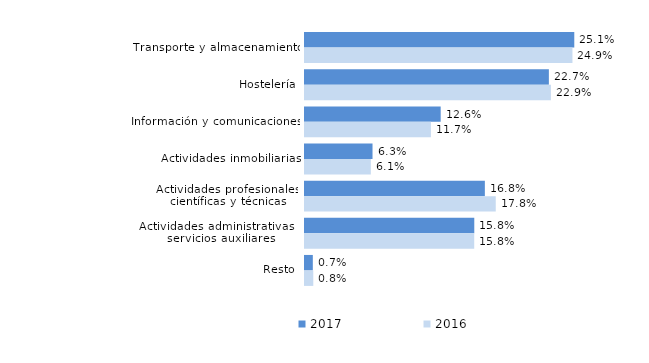
| Category | 2017 | 2016 |
|---|---|---|
| Transporte y almacenamiento | 0.251 | 0.249 |
| Hostelería | 0.227 | 0.229 |
| Información y comunicaciones | 0.126 | 0.117 |
| Actividades inmobiliarias | 0.063 | 0.061 |
| Actividades profesionales, científicas y técnicas | 0.168 | 0.178 |
| Actividades administrativas y servicios auxiliares | 0.158 | 0.158 |
| Resto | 0.007 | 0.008 |